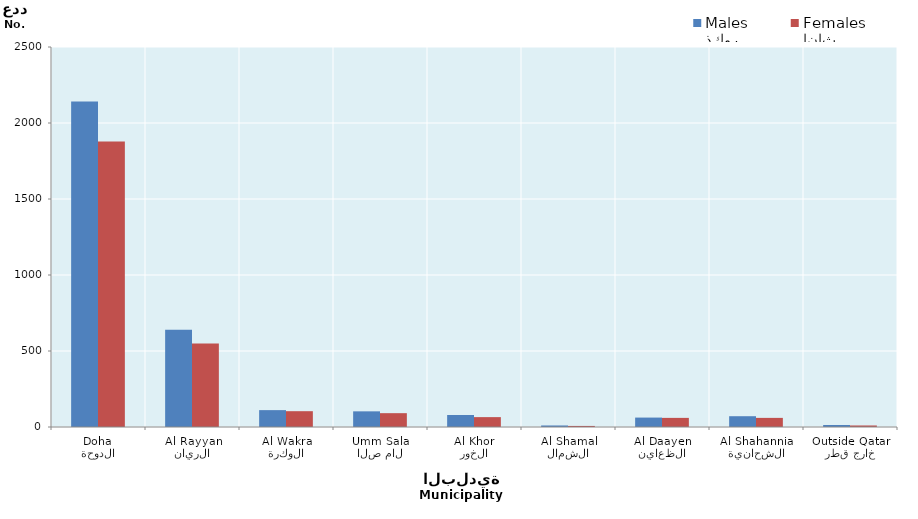
| Category | ذكور
Males | إناث
Females |
|---|---|---|
| الدوحة
Doha | 2141 | 1878 |
| الريان
Al Rayyan | 640 | 550 |
| الوكرة
Al Wakra | 111 | 104 |
| ام صلال
Umm Salal | 103 | 91 |
| الخور
Al Khor | 79 | 65 |
| الشمال
Al Shamal | 10 | 7 |
| الظعاين
Al Daayen | 62 | 60 |
| الشحانية
Al Shahannia | 71 | 60 |
| خارج قطر
Outside Qatar | 13 | 10 |